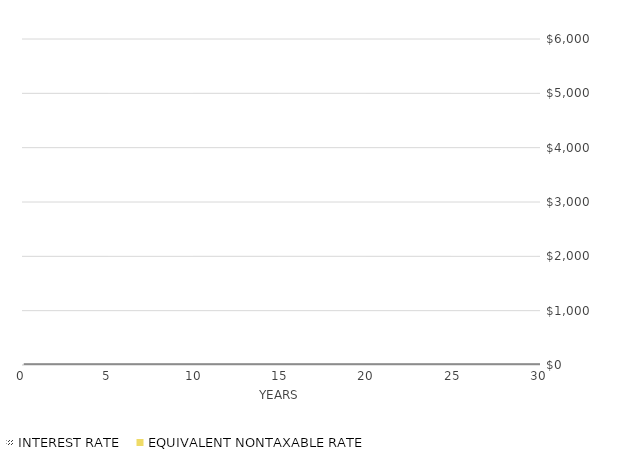
| Category | IR_Line |
|---|---|
| 0 | 5151.696 |
| 1 | 5190.334 |
| 2 | 5229.261 |
| 3 | 5268.481 |
| 4 | 5307.994 |
| 5 | 5347.804 |
| 6 | 5387.913 |
| 7 | 5428.322 |
| 8 | 5469.034 |
| 9 | 5510.052 |
| 10 | 5551.378 |
| 11 | 5593.013 |
| 12 | 5634.961 |
| 13 | 5677.223 |
| 14 | 5719.802 |
| 15 | 5762.7 |
| 16 | 5805.921 |
| 17 | 5849.465 |
| 18 | 5893.336 |
| 19 | 5937.536 |
| 20 | 5982.068 |
| 21 | 6026.933 |
| 22 | 6072.135 |
| 23 | 6117.676 |
| 24 | 6163.559 |
| 25 | 6209.785 |
| 26 | 6256.359 |
| 27 | 6303.282 |
| 28 | 6350.556 |
| 29 | 6398.185 |
| 30 | 6446.172 |
| 31 | 6494.518 |
| 32 | 6543.227 |
| 33 | 6592.301 |
| 34 | 6641.743 |
| 35 | 6691.556 |
| 36 | 6741.743 |
| 37 | 6792.306 |
| 38 | 6843.248 |
| 39 | 6894.573 |
| 40 | 6946.282 |
| 41 | 6998.379 |
| 42 | 7050.867 |
| 43 | 7103.749 |
| 44 | 7157.027 |
| 45 | 7210.704 |
| 46 | 7264.785 |
| 47 | 7319.271 |
| 48 | 7374.165 |
| 49 | 7429.471 |
| 50 | 7485.192 |
| 51 | 7541.331 |
| 52 | 7597.891 |
| 53 | 7654.875 |
| 54 | 7712.287 |
| 55 | 7770.129 |
| 56 | 7828.405 |
| 57 | 7887.118 |
| 58 | 7946.272 |
| 59 | 8005.869 |
| 60 | 8065.913 |
| 61 | 8126.407 |
| 62 | 8187.355 |
| 63 | 8248.76 |
| 64 | 8310.626 |
| 65 | 8372.956 |
| 66 | 8435.753 |
| 67 | 8499.021 |
| 68 | 8562.764 |
| 69 | 8626.984 |
| 70 | 8691.687 |
| 71 | 8756.874 |
| 72 | 8822.551 |
| 73 | 8888.72 |
| 74 | 8955.385 |
| 75 | 9022.551 |
| 76 | 9090.22 |
| 77 | 9158.397 |
| 78 | 9227.085 |
| 79 | 9296.288 |
| 80 | 9366.01 |
| 81 | 9436.255 |
| 82 | 9507.027 |
| 83 | 9578.33 |
| 84 | 9650.167 |
| 85 | 9722.543 |
| 86 | 9795.462 |
| 87 | 9868.928 |
| 88 | 9942.945 |
| 89 | 10017.517 |
| 90 | 10092.649 |
| 91 | 10168.344 |
| 92 | 10244.606 |
| 93 | 10321.441 |
| 94 | 10398.851 |
| 95 | 10476.843 |
| 96 | 10555.419 |
| 97 | 10634.585 |
| 98 | 10714.344 |
| 99 | 10794.702 |
| 100 | 10875.662 |
| 101 | 10957.23 |
| 102 | 11039.409 |
| 103 | 11122.204 |
| 104 | 11205.621 |
| 105 | 11289.663 |
| 106 | 11374.335 |
| 107 | 11459.643 |
| 108 | 11545.59 |
| 109 | 11632.182 |
| 110 | 11719.424 |
| 111 | 11807.319 |
| 112 | 11895.874 |
| 113 | 11985.093 |
| 114 | 12074.981 |
| 115 | 12165.544 |
| 116 | 12256.785 |
| 117 | 12348.711 |
| 118 | 12441.327 |
| 119 | 12534.637 |
| 120 | 12628.646 |
| 121 | 12723.361 |
| 122 | 12818.786 |
| 123 | 12914.927 |
| 124 | 13011.789 |
| 125 | 13109.378 |
| 126 | 13207.698 |
| 127 | 13306.756 |
| 128 | 13406.556 |
| 129 | 13507.106 |
| 130 | 13608.409 |
| 131 | 13710.472 |
| 132 | 13813.3 |
| 133 | 13916.9 |
| 134 | 14021.277 |
| 135 | 14126.437 |
| 136 | 14232.385 |
| 137 | 14339.128 |
| 138 | 14446.671 |
| 139 | 14555.021 |
| 140 | 14664.184 |
| 141 | 14774.165 |
| 142 | 14884.971 |
| 143 | 14996.609 |
| 144 | 15109.083 |
| 145 | 15222.401 |
| 146 | 15336.569 |
| 147 | 15451.594 |
| 148 | 15567.481 |
| 149 | 15684.237 |
| 150 | 15801.869 |
| 151 | 15920.383 |
| 152 | 16039.785 |
| 153 | 16160.084 |
| 154 | 16281.284 |
| 155 | 16403.394 |
| 156 | 16526.42 |
| 157 | 16650.368 |
| 158 | 16775.245 |
| 159 | 16901.06 |
| 160 | 17027.818 |
| 161 | 17155.526 |
| 162 | 17284.193 |
| 163 | 17413.824 |
| 164 | 17544.428 |
| 165 | 17676.011 |
| 166 | 17808.581 |
| 167 | 17942.146 |
| 168 | 18076.712 |
| 169 | 18212.287 |
| 170 | 18348.879 |
| 171 | 18486.496 |
| 172 | 18625.145 |
| 173 | 18764.833 |
| 174 | 18905.569 |
| 175 | 19047.361 |
| 176 | 19190.216 |
| 177 | 19334.143 |
| 178 | 19479.149 |
| 179 | 19625.243 |
| 180 | 19772.432 |
| 181 | 19920.725 |
| 182 | 20070.131 |
| 183 | 20220.657 |
| 184 | 20372.312 |
| 185 | 20525.104 |
| 186 | 20679.042 |
| 187 | 20834.135 |
| 188 | 20990.391 |
| 189 | 21147.819 |
| 190 | 21306.428 |
| 191 | 21466.226 |
| 192 | 21627.222 |
| 193 | 21789.427 |
| 194 | 21952.847 |
| 195 | 22117.494 |
| 196 | 22283.375 |
| 197 | 22450.5 |
| 198 | 22618.879 |
| 199 | 22788.521 |
| 200 | 22959.434 |
| 201 | 23131.63 |
| 202 | 23305.117 |
| 203 | 23479.906 |
| 204 | 23656.005 |
| 205 | 23833.425 |
| 206 | 24012.176 |
| 207 | 24192.267 |
| 208 | 24373.709 |
| 209 | 24556.512 |
| 210 | 24740.686 |
| 211 | 24926.241 |
| 212 | 25113.188 |
| 213 | 25301.537 |
| 214 | 25491.298 |
| 215 | 25682.483 |
| 216 | 25875.102 |
| 217 | 26069.165 |
| 218 | 26264.684 |
| 219 | 26461.669 |
| 220 | 26660.131 |
| 221 | 26860.082 |
| 222 | 27061.533 |
| 223 | 27264.494 |
| 224 | 27468.978 |
| 225 | 27674.995 |
| 226 | 27882.558 |
| 227 | 28091.677 |
| 228 | 28302.365 |
| 229 | 28514.632 |
| 230 | 28728.492 |
| 231 | 28943.956 |
| 232 | 29161.035 |
| 233 | 29379.743 |
| 234 | 29600.091 |
| 235 | 29822.092 |
| 236 | 30045.758 |
| 237 | 30271.101 |
| 238 | 30498.134 |
| 239 | 30726.87 |
| 240 | 30957.322 |
| 241 | 31189.502 |
| 242 | 31423.423 |
| 243 | 31659.098 |
| 244 | 31896.542 |
| 245 | 32135.766 |
| 246 | 32376.784 |
| 247 | 32619.61 |
| 248 | 32864.257 |
| 249 | 33110.739 |
| 250 | 33359.069 |
| 251 | 33609.262 |
| 252 | 33861.332 |
| 253 | 34115.292 |
| 254 | 34371.157 |
| 255 | 34628.94 |
| 256 | 34888.657 |
| 257 | 35150.322 |
| 258 | 35413.95 |
| 259 | 35679.554 |
| 260 | 35947.151 |
| 261 | 36216.755 |
| 262 | 36488.38 |
| 263 | 36762.043 |
| 264 | 37037.758 |
| 265 | 37315.542 |
| 266 | 37595.408 |
| 267 | 37877.374 |
| 268 | 38161.454 |
| 269 | 38447.665 |
| 270 | 38736.022 |
| 271 | 39026.543 |
| 272 | 39319.242 |
| 273 | 39614.136 |
| 274 | 39911.242 |
| 275 | 40210.576 |
| 276 | 40512.156 |
| 277 | 40815.997 |
| 278 | 41122.117 |
| 279 | 41430.533 |
| 280 | 41741.262 |
| 281 | 42054.321 |
| 282 | 42369.728 |
| 283 | 42687.501 |
| 284 | 43007.658 |
| 285 | 43330.215 |
| 286 | 43655.192 |
| 287 | 43982.606 |
| 288 | 44312.475 |
| 289 | 44644.819 |
| 290 | 44979.655 |
| 291 | 45317.002 |
| 292 | 45656.88 |
| 293 | 45999.306 |
| 294 | 46344.301 |
| 295 | 46691.884 |
| 296 | 47042.073 |
| 297 | 47394.888 |
| 298 | 47750.35 |
| 299 | 48108.477 |
| 300 | 48469.291 |
| 301 | 48832.811 |
| 302 | 49199.057 |
| 303 | 49568.05 |
| 304 | 49939.81 |
| 305 | 50314.359 |
| 306 | 50691.716 |
| 307 | 51071.904 |
| 308 | 51454.944 |
| 309 | 51840.856 |
| 310 | 52229.662 |
| 311 | 52621.385 |
| 312 | 53016.045 |
| 313 | 53413.665 |
| 314 | 53814.268 |
| 315 | 54217.875 |
| 316 | 54624.509 |
| 317 | 55034.193 |
| 318 | 55446.949 |
| 319 | 55862.801 |
| 320 | 56281.772 |
| 321 | 56703.885 |
| 322 | 57129.165 |
| 323 | 57557.633 |
| 324 | 57989.316 |
| 325 | 58424.235 |
| 326 | 58862.417 |
| 327 | 59303.885 |
| 328 | 59748.664 |
| 329 | 60196.779 |
| 330 | 60648.255 |
| 331 | 61103.117 |
| 332 | 61561.391 |
| 333 | 62023.101 |
| 334 | 62488.274 |
| 335 | 62956.936 |
| 336 | 63429.113 |
| 337 | 63904.832 |
| 338 | 64384.118 |
| 339 | 64866.999 |
| 340 | 65353.501 |
| 341 | 65843.653 |
| 342 | 66337.48 |
| 343 | 66835.011 |
| 344 | 67336.274 |
| 345 | 67841.296 |
| 346 | 68350.105 |
| 347 | 68862.731 |
| 348 | 69379.202 |
| 349 | 69899.546 |
| 350 | 70423.792 |
| 351 | 70951.971 |
| 352 | 71484.111 |
| 353 | 72020.241 |
| 354 | 72560.393 |
| 355 | 73104.596 |
| 356 | 73652.881 |
| 357 | 74205.277 |
| 358 | 74761.817 |
| 359 | 75322.53 |
| 360 | 75887.449 |